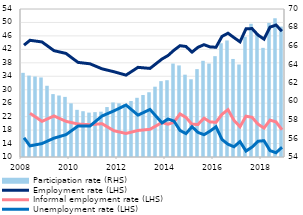
| Category | Participation rate (RHS) |
|---|---|
| 2008 | 63.1 |
| II | 62.8 |
| III | 62.7 |
| IV | 62.6 |
| 2009 | 61.7 |
| II | 60.8 |
| III | 60.65 |
| IV | 60.5 |
| 2010 | 59.8 |
| II | 59.1 |
| III | 58.95 |
| IV | 58.8 |
| 2011 | 58.85 |
| II | 58.9 |
| III | 59.4 |
| IV | 59.9 |
| 2012 | 59.8 |
| II | 59.7 |
| III | 60.05 |
| IV | 60.4 |
| 2013 | 60.7 |
| II | 61 |
| III | 61.6 |
| IV | 62.2 |
| 2014 | 62.3 |
| II | 64.1 |
| III | 63.9 |
| IV | 62.9 |
| 2015 | 62.4 |
| II | 63.5 |
| III | 64.4 |
| IV | 64.1 |
| 2016 | 64.9 |
| II | 66.3 |
| III | 66.6 |
| IV | 64.6 |
| 2017 | 64 |
| II | 67 |
| III | 68.4 |
| IV | 67.4 |
| 2018 | 65.8 |
| II | 68.5 |
| III | 69 |
| IV | 68.1 |